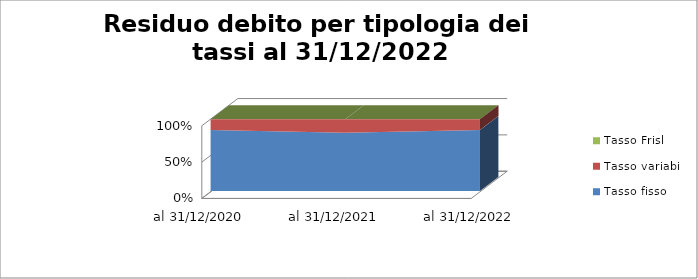
| Category | Tasso fisso | Tasso variabile | Tasso Frisl |
|---|---|---|---|
| al 31/12/2020 | 3057.9 | 534 | 1.8 |
| al 31/12/2021 | 2989.142 | 692.054 | 1.554 |
| al 31/12/2022 | 3067.626 | 531.57 | 1.35 |